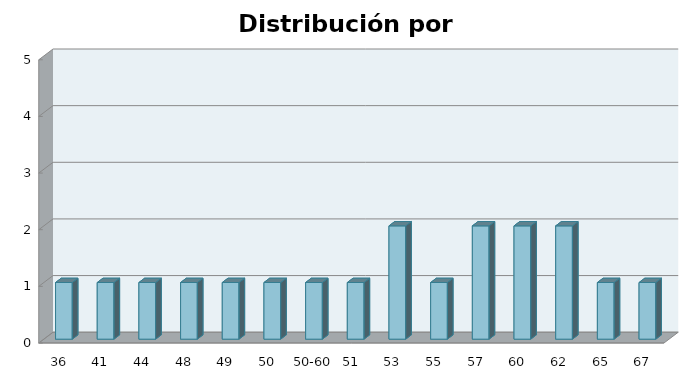
| Category | Series 1 |
|---|---|
| 36 | 1 |
| 41 | 1 |
| 44 | 1 |
| 48 | 1 |
| 49 | 1 |
| 50 | 1 |
| 50-60 | 1 |
| 51 | 1 |
| 53 | 2 |
| 55 | 1 |
| 57 | 2 |
| 60 | 2 |
| 62 | 2 |
| 65 | 1 |
| 67 | 1 |